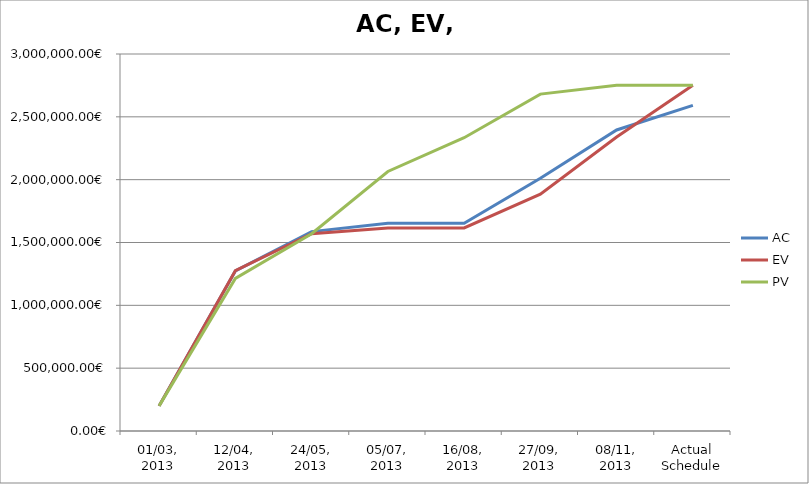
| Category | AC | EV | PV |
|---|---|---|---|
| 01/03, 2013 | 200000 | 200000 | 200000 |
| 12/04, 2013 | 1273343.412 | 1275129.212 | 1213794.963 |
| 24/05, 2013 | 1586644.609 | 1569680.409 | 1569680.409 |
| 05/07, 2013 | 1653249.008 | 1615797.208 | 2065219.608 |
| 16/08, 2013 | 1653249.008 | 1615797.208 | 2333750.807 |
| 27/09, 2013 | 2010887.808 | 1884706.808 | 2680927.742 |
| 08/11, 2013 | 2395422.077 | 2340001.208 | 2750938 |
| Actual Schedule | 2590796.726 | 2750938 | 2750938 |